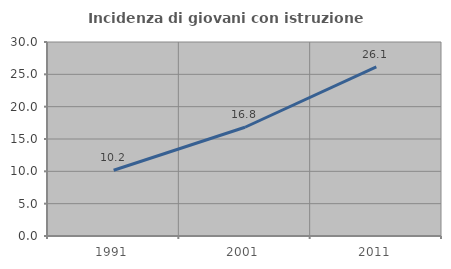
| Category | Incidenza di giovani con istruzione universitaria |
|---|---|
| 1991.0 | 10.165 |
| 2001.0 | 16.816 |
| 2011.0 | 26.143 |